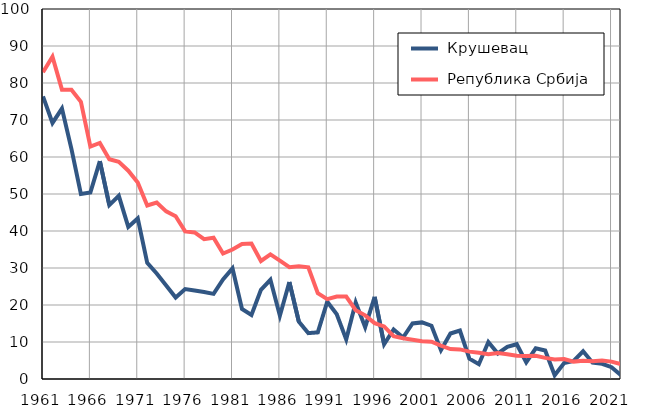
| Category |  Крушевац |  Република Србија |
|---|---|---|
| 1961.0 | 76.4 | 82.9 |
| 1962.0 | 69.2 | 87.1 |
| 1963.0 | 73.1 | 78.2 |
| 1964.0 | 62.2 | 78.2 |
| 1965.0 | 50 | 74.9 |
| 1966.0 | 50.4 | 62.8 |
| 1967.0 | 58.9 | 63.8 |
| 1968.0 | 47 | 59.4 |
| 1969.0 | 49.5 | 58.7 |
| 1970.0 | 41.1 | 56.3 |
| 1971.0 | 43.4 | 53.1 |
| 1972.0 | 31.4 | 46.9 |
| 1973.0 | 28.5 | 47.7 |
| 1974.0 | 25.3 | 45.3 |
| 1975.0 | 22 | 44 |
| 1976.0 | 24.3 | 39.9 |
| 1977.0 | 23.9 | 39.6 |
| 1978.0 | 23.5 | 37.8 |
| 1979.0 | 23 | 38.2 |
| 1980.0 | 26.9 | 33.9 |
| 1981.0 | 29.9 | 35 |
| 1982.0 | 18.9 | 36.5 |
| 1983.0 | 17.3 | 36.6 |
| 1984.0 | 24.1 | 31.9 |
| 1985.0 | 26.8 | 33.7 |
| 1986.0 | 17.1 | 32 |
| 1987.0 | 26.2 | 30.2 |
| 1988.0 | 15.5 | 30.5 |
| 1989.0 | 12.4 | 30.2 |
| 1990.0 | 12.6 | 23.2 |
| 1991.0 | 20.9 | 21.6 |
| 1992.0 | 17.5 | 22.3 |
| 1993.0 | 10.7 | 22.3 |
| 1994.0 | 20.7 | 18.6 |
| 1995.0 | 14 | 17.2 |
| 1996.0 | 22.2 | 15.1 |
| 1997.0 | 9.4 | 14.2 |
| 1998.0 | 13.4 | 11.6 |
| 1999.0 | 11.2 | 11 |
| 2000.0 | 15 | 10.6 |
| 2001.0 | 15.3 | 10.2 |
| 2002.0 | 14.4 | 10.1 |
| 2003.0 | 7.8 | 9 |
| 2004.0 | 12.3 | 8.1 |
| 2005.0 | 13.1 | 8 |
| 2006.0 | 5.5 | 7.4 |
| 2007.0 | 4 | 7.1 |
| 2008.0 | 10 | 6.7 |
| 2009.0 | 6.9 | 7 |
| 2010.0 | 8.7 | 6.7 |
| 2011.0 | 9.4 | 6.3 |
| 2012.0 | 4.5 | 6.2 |
| 2013.0 | 8.3 | 6.3 |
| 2014.0 | 7.7 | 5.7 |
| 2015.0 | 1 | 5.3 |
| 2016.0 | 4.3 | 5.4 |
| 2017.0 | 4.9 | 4.7 |
| 2018.0 | 7.5 | 4.9 |
| 2019.0 | 4.4 | 4.8 |
| 2020.0 | 4.1 | 5 |
| 2021.0 | 3.2 | 4.7 |
| 2022.0 | 1 | 4 |